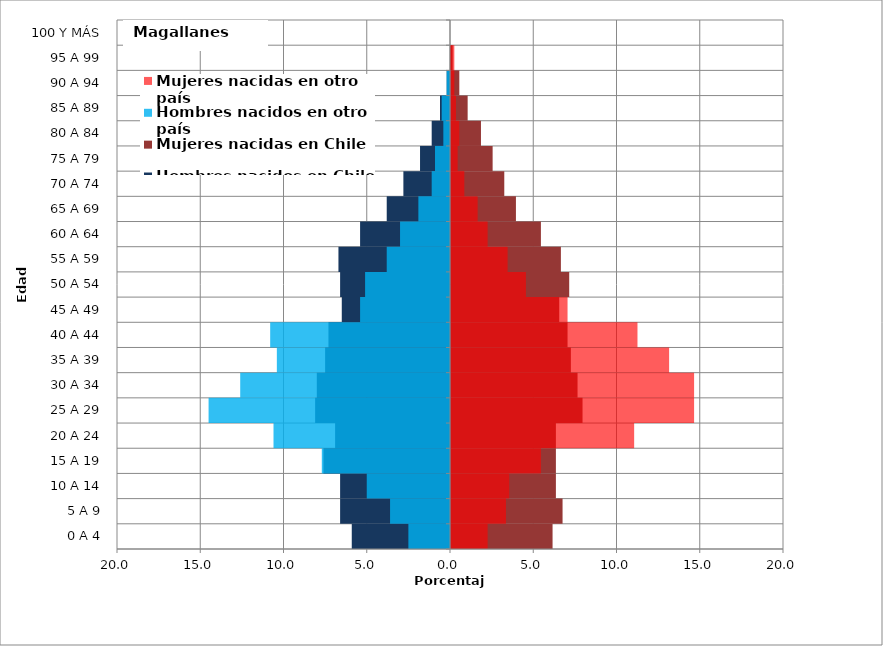
| Category | Hombres nacidos en Chile | Mujeres nacidas en Chile | Hombres nacidos en otro país | Mujeres nacidas en otro país |
|---|---|---|---|---|
| 0 A 4 | -5.9 | 6.1 | -2.5 | 2.2 |
| 5 A 9 | -6.6 | 6.7 | -3.6 | 3.3 |
| 10 A 14 | -6.6 | 6.3 | -5 | 3.5 |
| 15 A 19 | -7.6 | 6.3 | -7.7 | 5.4 |
| 20 A 24 | -6.9 | 6.3 | -10.6 | 11 |
| 25 A 29 | -8.1 | 7.9 | -14.5 | 14.6 |
| 30 A 34 | -8 | 7.6 | -12.6 | 14.6 |
| 35 A 39 | -7.5 | 7.2 | -10.4 | 13.1 |
| 40 A 44 | -7.3 | 7 | -10.8 | 11.2 |
| 45 A 49 | -6.5 | 6.5 | -5.4 | 7 |
| 50 A 54 | -6.6 | 7.1 | -5.1 | 4.5 |
| 55 A 59 | -6.7 | 6.6 | -3.8 | 3.4 |
| 60 A 64 | -5.4 | 5.4 | -3 | 2.2 |
| 65 A 69 | -3.8 | 3.9 | -1.9 | 1.6 |
| 70 A 74 | -2.8 | 3.2 | -1.1 | 0.8 |
| 75 A 79 | -1.8 | 2.5 | -0.9 | 0.4 |
| 80 A 84 | -1.1 | 1.8 | -0.4 | 0.5 |
| 85 A 89 | -0.6 | 1 | -0.5 | 0.3 |
| 90 A 94 | -0.2 | 0.5 | -0.2 | 0.2 |
| 95 A 99 | 0 | 0.1 | 0 | 0.2 |
| 100 Y MÁS | 0 | 0 | 0 | 0 |